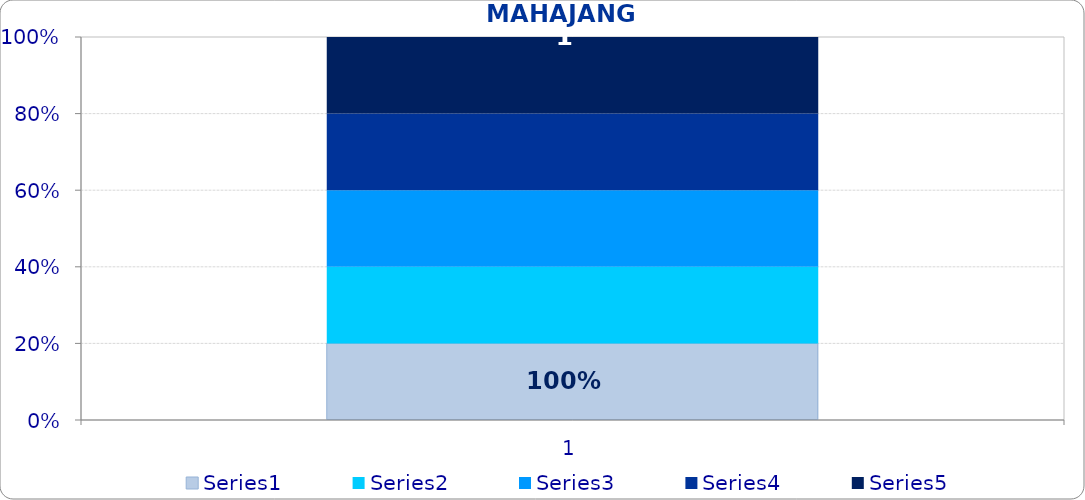
| Category | Series 0 | Series 1 | Series 2 | Series 3 | Series 4 |
|---|---|---|---|---|---|
| 0 | 1 | 1 | 1 | 1 | 1 |